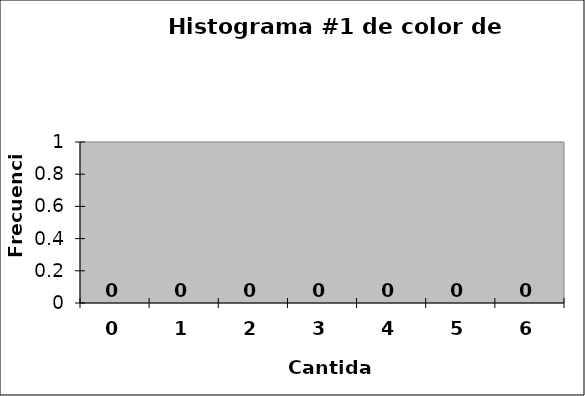
| Category | Frequency |
|---|---|
| 0.0 | 0 |
| 1.0 | 0 |
| 2.0 | 0 |
| 3.0 | 0 |
| 4.0 | 0 |
| 5.0 | 0 |
| 6.0 | 0 |